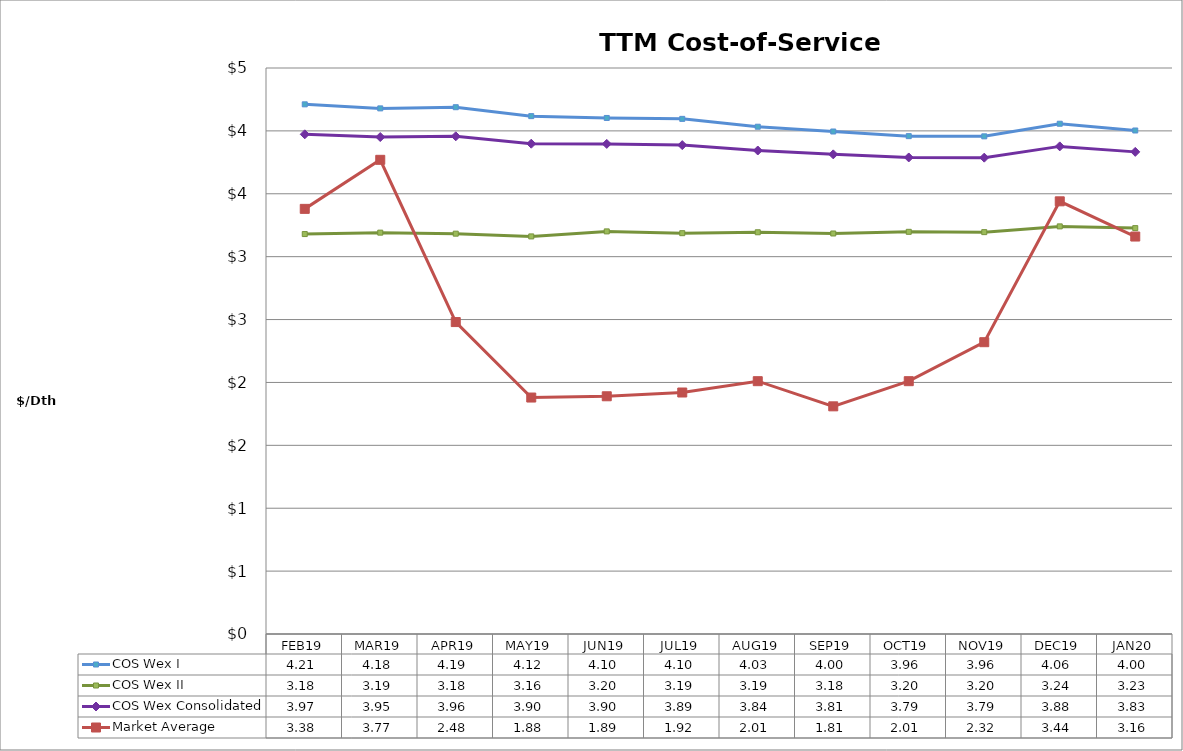
| Category | COS Wex I | COS Wex II | COS Wex Consolidated | Market Average |
|---|---|---|---|---|
| FEB19 | 4.211 | 3.18 | 3.973 | 3.38 |
| MAR19 | 4.179 | 3.191 | 3.951 | 3.77 |
| APR19 | 4.188 | 3.183 | 3.957 | 2.48 |
| MAY19 | 4.117 | 3.161 | 3.898 | 1.88 |
| JUN19 | 4.103 | 3.201 | 3.896 | 1.89 |
| JUL19 | 4.096 | 3.187 | 3.887 | 1.92 |
| AUG19 | 4.033 | 3.194 | 3.844 | 2.01 |
| SEP19 | 3.995 | 3.184 | 3.814 | 1.81 |
| OCT19 | 3.958 | 3.197 | 3.789 | 2.01 |
| NOV19 | 3.957 | 3.195 | 3.787 | 2.32 |
| DEC19 | 4.057 | 3.241 | 3.877 | 3.44 |
| JAN20 | 4.003 | 3.227 | 3.833 | 3.16 |